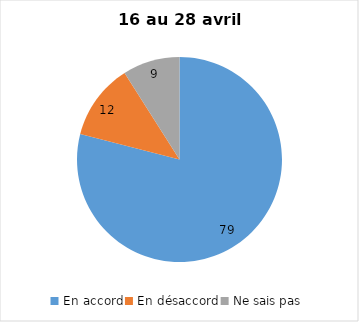
| Category | Series 0 |
|---|---|
| En accord | 79 |
| En désaccord | 12 |
| Ne sais pas | 9 |